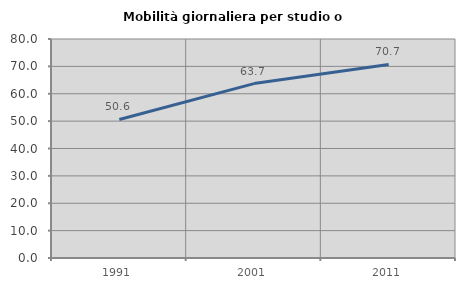
| Category | Mobilità giornaliera per studio o lavoro |
|---|---|
| 1991.0 | 50.599 |
| 2001.0 | 63.717 |
| 2011.0 | 70.723 |